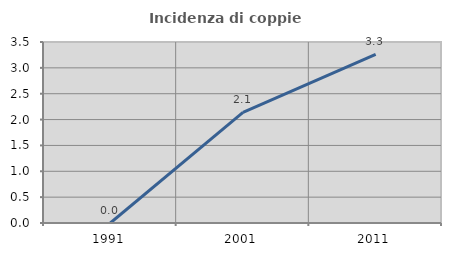
| Category | Incidenza di coppie miste |
|---|---|
| 1991.0 | 0 |
| 2001.0 | 2.138 |
| 2011.0 | 3.259 |